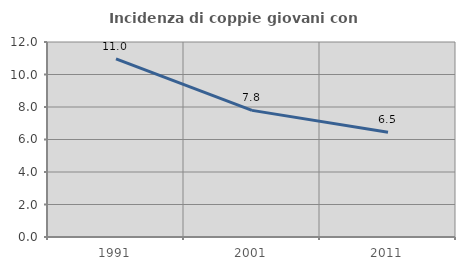
| Category | Incidenza di coppie giovani con figli |
|---|---|
| 1991.0 | 10.959 |
| 2001.0 | 7.792 |
| 2011.0 | 6.452 |